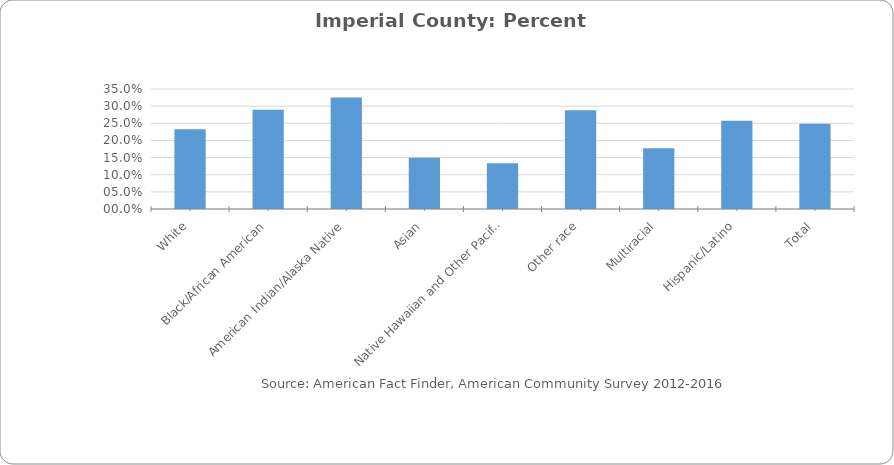
| Category | Percent Population below Poverty Level in Imperial County |
|---|---|
| White | 0.233 |
| Black/African American | 0.29 |
| American Indian/Alaska Native | 0.325 |
| Asian | 0.149 |
|  Native Hawaiian and Other Pacific Islander | 0.133 |
| Other race | 0.288 |
| Multiracial | 0.177 |
| Hispanic/Latino | 0.258 |
| Total | 0.249 |